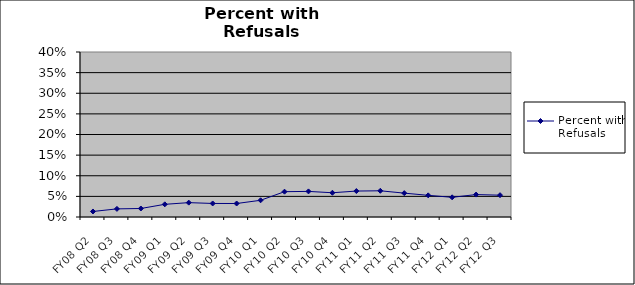
| Category | Percent with Refusals |
|---|---|
| FY08 Q2 | 0.013 |
| FY08 Q3 | 0.02 |
| FY08 Q4 | 0.021 |
| FY09 Q1 | 0.031 |
| FY09 Q2 | 0.035 |
| FY09 Q3 | 0.033 |
| FY09 Q4 | 0.033 |
| FY10 Q1 | 0.041 |
| FY10 Q2 | 0.061 |
| FY10 Q3 | 0.062 |
| FY10 Q4 | 0.059 |
| FY11 Q1 | 0.063 |
| FY11 Q2 | 0.064 |
| FY11 Q3 | 0.058 |
| FY11 Q4 | 0.053 |
| FY12 Q1 | 0.048 |
| FY12 Q2 | 0.054 |
| FY12 Q3 | 0.053 |